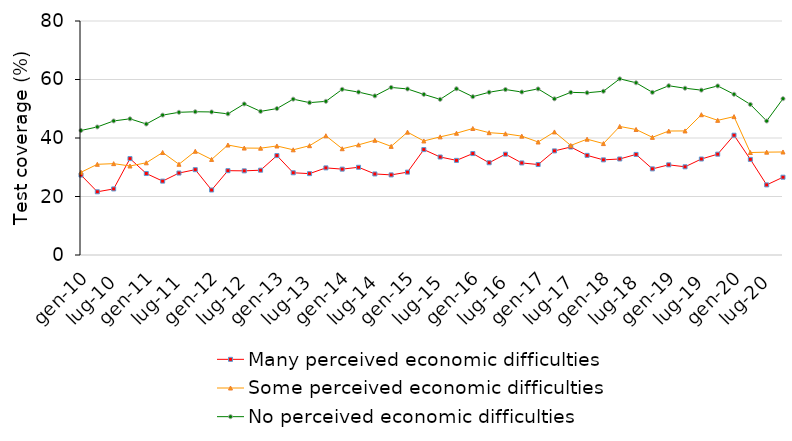
| Category | Many perceived economic difficulties | Some perceived economic difficulties | No perceived economic difficulties |
|---|---|---|---|
| gen-10 | 27.336 | 28.283 | 42.565 |
| apr-10 | 21.611 | 31.006 | 43.785 |
| lug-10 | 22.589 | 31.232 | 45.833 |
| ott-10 | 32.954 | 30.43 | 46.556 |
| gen-11 | 27.856 | 31.523 | 44.785 |
| apr-11 | 25.261 | 35.046 | 47.825 |
| lug-11 | 28.019 | 31.022 | 48.783 |
| ott-11 | 29.174 | 35.47 | 48.976 |
| gen-12 | 22.226 | 32.673 | 48.905 |
| apr-12 | 28.831 | 37.606 | 48.255 |
| lug-12 | 28.769 | 36.562 | 51.643 |
| ott-12 | 28.994 | 36.52 | 49.096 |
| gen-13 | 33.986 | 37.273 | 50.065 |
| apr-13 | 28.111 | 35.966 | 53.275 |
| lug-13 | 27.819 | 37.372 | 52.083 |
| ott-13 | 29.784 | 40.76 | 52.536 |
| gen-14 | 29.356 | 36.333 | 56.635 |
| apr-14 | 29.991 | 37.666 | 55.695 |
| lug-14 | 27.709 | 39.222 | 54.403 |
| ott-14 | 27.384 | 37.14 | 57.286 |
| gen-15 | 28.326 | 42.003 | 56.765 |
| apr-15 | 36.041 | 38.986 | 54.905 |
| lug-15 | 33.499 | 40.392 | 53.213 |
| ott-15 | 32.354 | 41.64 | 56.836 |
| gen-16 | 34.676 | 43.243 | 54.125 |
| apr-16 | 31.541 | 41.816 | 55.645 |
| lug-16 | 34.479 | 41.452 | 56.573 |
| ott-16 | 31.474 | 40.64 | 55.726 |
| gen-17 | 30.926 | 38.633 | 56.785 |
| apr-17 | 35.591 | 42.076 | 53.395 |
| lug-17 | 36.919 | 37.452 | 55.603 |
| ott-17 | 34.064 | 39.6 | 55.466 |
| gen-18 | 32.526 | 38.093 | 55.975 |
| apr-18 | 32.831 | 43.946 | 60.225 |
| lug-18 | 34.389 | 42.922 | 58.883 |
| ott-18 | 29.444 | 40.23 | 55.606 |
| gen-19 | 30.826 | 42.383 | 57.865 |
| apr-19 | 30.151 | 42.416 | 57.015 |
| lug-19 | 32.819 | 47.962 | 56.363 |
| ott-19 | 34.474 | 46.04 | 57.806 |
| gen-20 | 40.956 | 47.313 | 54.945 |
| apr-20 | 32.691 | 35.036 | 51.475 |
| lug-20 | 23.969 | 35.162 | 45.813 |
| ott-20 | 26.594 | 35.22 | 53.436 |